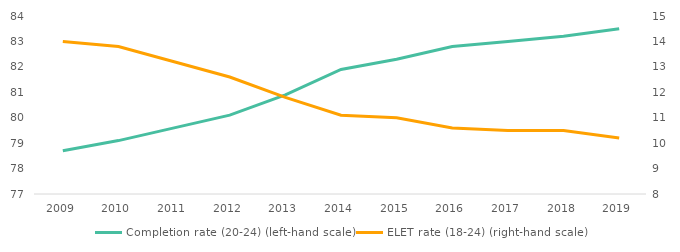
| Category | Completion rate (20-24) (left-hand scale) |
|---|---|
| 2009 | 78.7 |
| 2010 | 79.1 |
| 2011 | 79.6 |
| 2012 | 80.1 |
| 2013 | 80.9 |
| 2014 | 81.9 |
| 2015 | 82.3 |
| 2016 | 82.8 |
| 2017 | 83 |
| 2018 | 83.2 |
| 2019 | 83.5 |